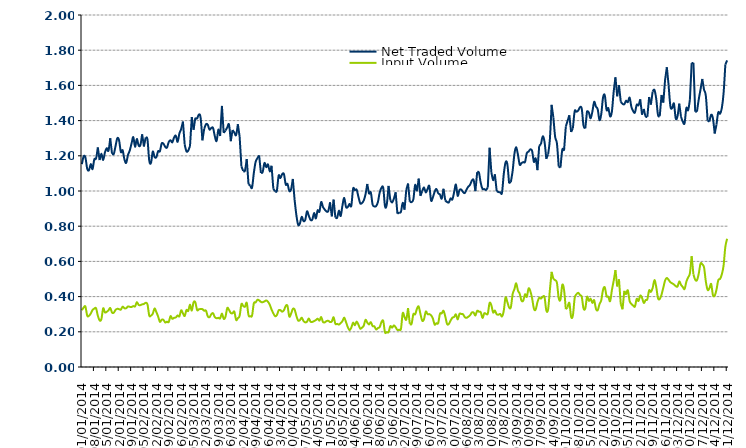
| Category | Net Traded Volume | Input Volume |
|---|---|---|
| 01/01/2013 | 0 | 0 |
| 02/01/2013 | 0 | 0 |